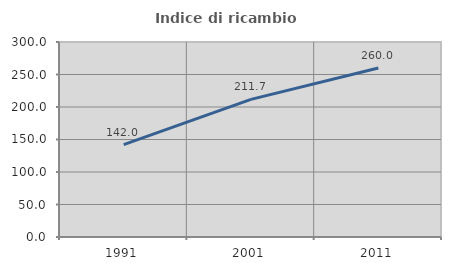
| Category | Indice di ricambio occupazionale  |
|---|---|
| 1991.0 | 142.029 |
| 2001.0 | 211.724 |
| 2011.0 | 260 |